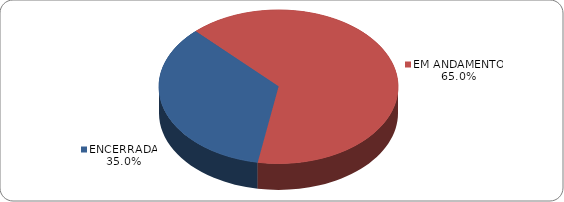
| Category | Series 0 |
|---|---|
| ENCERRADA | 0.35 |
| EM ANDAMENTO | 0.65 |